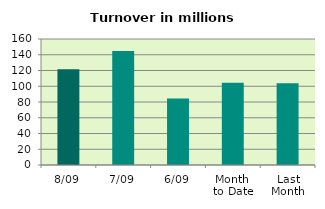
| Category | Series 0 |
|---|---|
| 8/09 | 121.487 |
| 7/09 | 144.797 |
| 6/09 | 84.356 |
| Month 
to Date | 104.427 |
| Last
Month | 103.765 |